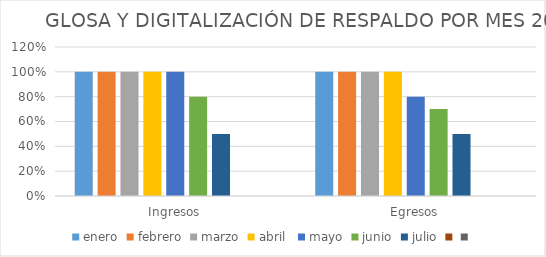
| Category | enero | febrero | marzo | abril  | mayo | junio | julio | Series 7 | Series 8 |
|---|---|---|---|---|---|---|---|---|---|
| Ingresos | 1 | 1 | 1 | 1 | 1 | 0.8 | 0.5 |  |  |
| Egresos | 1 | 1 | 1 | 1 | 0.8 | 0.7 | 0.5 |  |  |